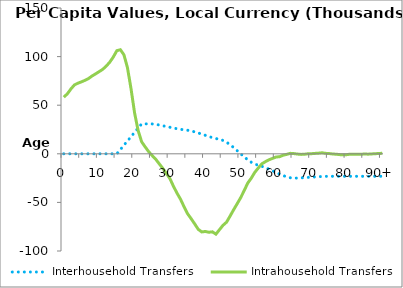
| Category | Interhousehold Transfers | Intrahousehold Transfers |
|---|---|---|
| 0 | 0 | 58275.189 |
|  | 0 | 61639.9 |
| 2 | 0 | 66619.622 |
| 3 | 0 | 70841.164 |
| 4 | 0 | 72655.178 |
| 5 | 0 | 74037.637 |
| 6 | 0 | 75578.374 |
| 7 | 0 | 77437.011 |
| 8 | 0 | 80081.127 |
| 9 | 0 | 82260.114 |
| 10 | 0 | 84545.144 |
| 11 | 0 | 86859.611 |
| 12 | 0 | 90238.988 |
| 13 | 0 | 94269.683 |
| 14 | 0 | 99604.568 |
| 15 | 0 | 106084.814 |
| 16 | 4394.052 | 107071.093 |
| 17 | 8788.099 | 101884.049 |
| 18 | 13182.154 | 88645.57 |
| 19 | 17576.209 | 67127.088 |
| 20 | 21970.254 | 42415.768 |
| 21 | 26364.308 | 24152.123 |
| 22 | 30758.363 | 12389.723 |
| 23 | 30758.363 | 7141.766 |
| 24 | 30814.984 | 2159.866 |
| 25 | 30738.158 | -1847.271 |
| 26 | 30309.897 | -5672.182 |
| 27 | 29611.403 | -10394.864 |
| 28 | 28817.974 | -15052.482 |
| 29 | 28037.445 | -20253.019 |
| 30 | 27271.199 | -25540.424 |
| 31 | 26511.636 | -33422.509 |
| 32 | 25797.752 | -40454.235 |
| 33 | 25198.534 | -46781.067 |
| 34 | 24724.103 | -54505.457 |
| 35 | 24214.218 | -61680.692 |
| 36 | 23519.191 | -66799.789 |
| 37 | 22566.083 | -72096.65 |
| 38 | 21430.568 | -77714.971 |
| 39 | 20222.399 | -80388.54 |
| 40 | 19003.602 | -79920.478 |
| 41 | 17795.43 | -80697.89 |
| 42 | 16659.914 | -80288.508 |
| 43 | 15706.814 | -82679.903 |
| 44 | 14886.83 | -78068.033 |
| 45 | 13745.529 | -73562.53 |
| 46 | 11947.922 | -70338.73 |
| 47 | 9426.472 | -64085.271 |
| 48 | 6422.48 | -57577.006 |
| 49 | 3226.262 | -51404.122 |
| 50 | 1.942 | -45133.775 |
| 51 | -3194.265 | -37733.6 |
| 52 | -6198.268 | -30091.992 |
| 53 | -8719.718 | -25018.241 |
| 54 | -10541.454 | -18998.082 |
| 55 | -11804.725 | -14465.037 |
| 56 | -12880.313 | -10279.02 |
| 57 | -14204.745 | -8074.993 |
| 58 | -15782.641 | -6120.187 |
| 59 | -17461.499 | -4726.04 |
| 60 | -19155.129 | -3313.277 |
| 61 | -20833.992 | -2972.338 |
| 62 | -22411.89 | -1458.184 |
| 63 | -23736.324 | -603.346 |
| 64 | -24635.288 | 459.067 |
| 65 | -25006.155 | 236.996 |
| 66 | -24957.761 | -262.365 |
| 67 | -24762.38 | -608.02 |
| 68 | -24529.613 | -519.055 |
| 69 | -24281.939 | 74.515 |
| 70 | -24032.1 | 120.479 |
| 71 | -23784.425 | 406.443 |
| 72 | -23551.658 | 651.539 |
| 73 | -23356.278 | 1042.656 |
| 74 | -23221.829 | 465.984 |
| 75 | -23157.897 | 258.931 |
| 76 | -23145.706 | -207.383 |
| 77 | -23146.436 | -442.374 |
| 78 | -23147.318 | -841.979 |
| 79 | -23148.251 | -1058.504 |
| 80 | -23149.194 | -854.024 |
| 81 | -23150.128 | -348.467 |
| 82 | -23151 | -506.178 |
| 83 | -23151.74 | -549.351 |
| 84 | -23152.248 | -445.994 |
| 85 | -23152.486 | -222.544 |
| 86 | -23152.538 | -372.133 |
| 87 | -23152.538 | -140.767 |
| 88 | -23152.538 | 117.312 |
| 89 | -23152.538 | 270.027 |
| 90+ | -23152.538 | 548.151 |